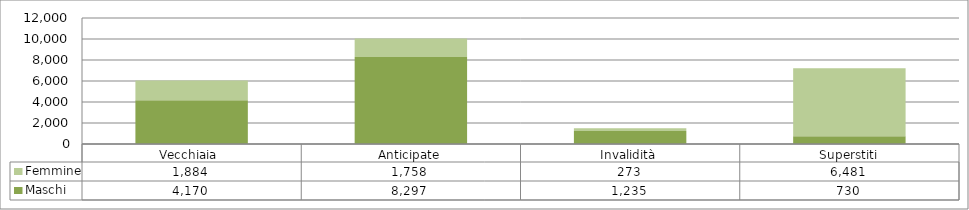
| Category | Maschi | Femmine |
|---|---|---|
| Vecchiaia  | 4170 | 1884 |
| Anticipate | 8297 | 1758 |
| Invalidità | 1235 | 273 |
| Superstiti | 730 | 6481 |